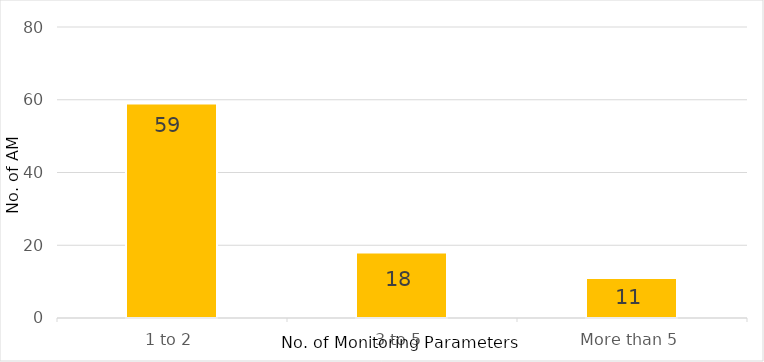
| Category | Series 0 |
|---|---|
| 0 | 59 |
| 1 | 18 |
| 2 | 11 |